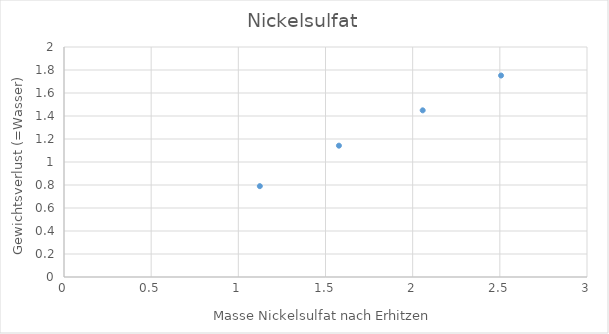
| Category | Series 0 |
|---|---|
| 2.0575 | 1.449 |
| 1.1233 | 0.79 |
| 1.577 | 1.142 |
| 2.507 | 1.752 |